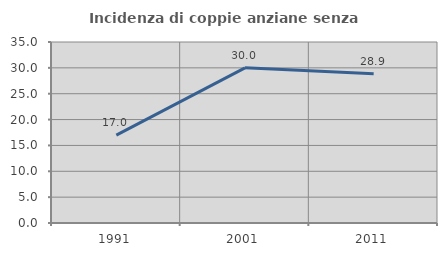
| Category | Incidenza di coppie anziane senza figli  |
|---|---|
| 1991.0 | 17.007 |
| 2001.0 | 30 |
| 2011.0 | 28.877 |